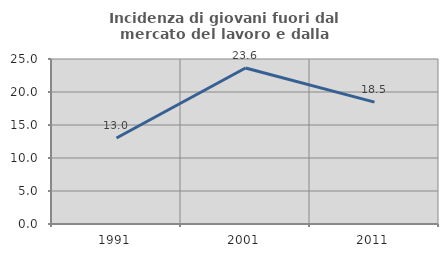
| Category | Incidenza di giovani fuori dal mercato del lavoro e dalla formazione  |
|---|---|
| 1991.0 | 13.027 |
| 2001.0 | 23.642 |
| 2011.0 | 18.466 |